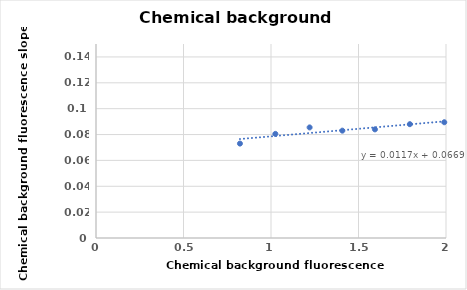
| Category | Series 0 |
|---|---|
| 0.8226 | 0.073 |
| 1.0249 | 0.08 |
| 1.2207 | 0.086 |
| 1.4077 | 0.083 |
| 1.594 | 0.084 |
| 1.7934 | 0.088 |
| 1.9901 | 0.09 |